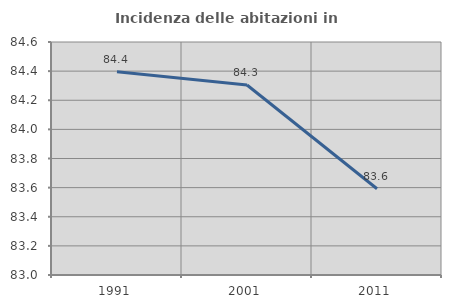
| Category | Incidenza delle abitazioni in proprietà  |
|---|---|
| 1991.0 | 84.395 |
| 2001.0 | 84.305 |
| 2011.0 | 83.592 |